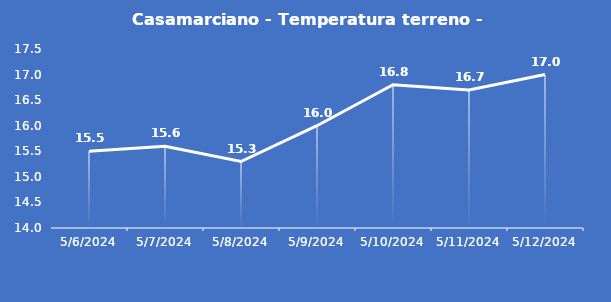
| Category | Casamarciano - Temperatura terreno - Grezzo (°C) |
|---|---|
| 5/6/24 | 15.5 |
| 5/7/24 | 15.6 |
| 5/8/24 | 15.3 |
| 5/9/24 | 16 |
| 5/10/24 | 16.8 |
| 5/11/24 | 16.7 |
| 5/12/24 | 17 |